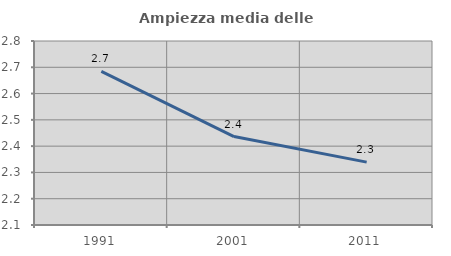
| Category | Ampiezza media delle famiglie |
|---|---|
| 1991.0 | 2.684 |
| 2001.0 | 2.436 |
| 2011.0 | 2.339 |